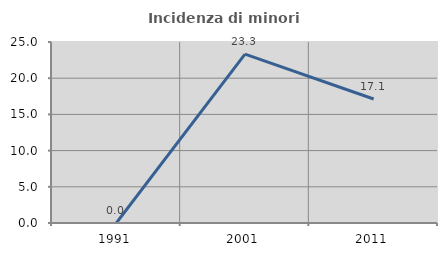
| Category | Incidenza di minori stranieri |
|---|---|
| 1991.0 | 0 |
| 2001.0 | 23.333 |
| 2011.0 | 17.13 |